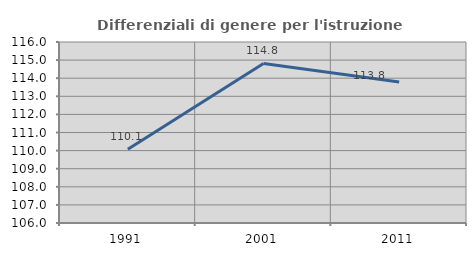
| Category | Differenziali di genere per l'istruzione superiore |
|---|---|
| 1991.0 | 110.07 |
| 2001.0 | 114.818 |
| 2011.0 | 113.786 |